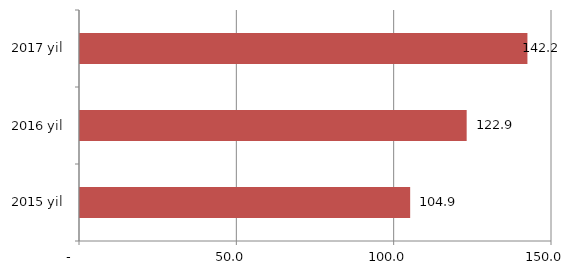
| Category | Series 0 |
|---|---|
| 2015 yil | 104.926 |
| 2016 yil | 122.883 |
| 2017 yil | 142.191 |